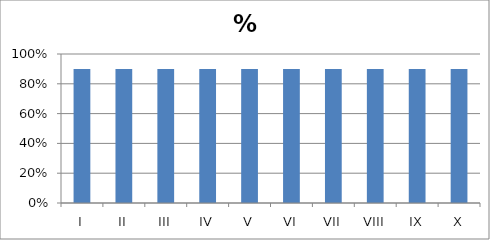
| Category | % Scored |
|---|---|
| I | 0.9 |
| II | 0.9 |
| III | 0.9 |
| IV | 0.9 |
| V | 0.9 |
| VI | 0.9 |
| VII | 0.9 |
| VIII | 0.9 |
| IX | 0.9 |
| X | 0.9 |